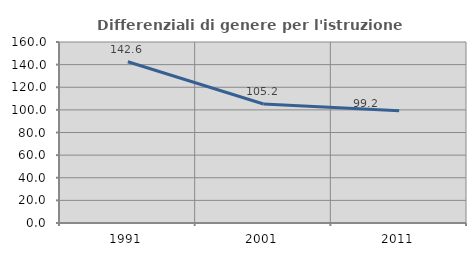
| Category | Differenziali di genere per l'istruzione superiore |
|---|---|
| 1991.0 | 142.581 |
| 2001.0 | 105.206 |
| 2011.0 | 99.228 |